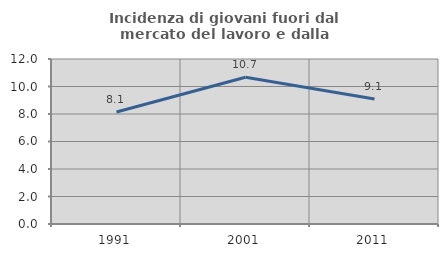
| Category | Incidenza di giovani fuori dal mercato del lavoro e dalla formazione  |
|---|---|
| 1991.0 | 8.14 |
| 2001.0 | 10.677 |
| 2011.0 | 9.091 |